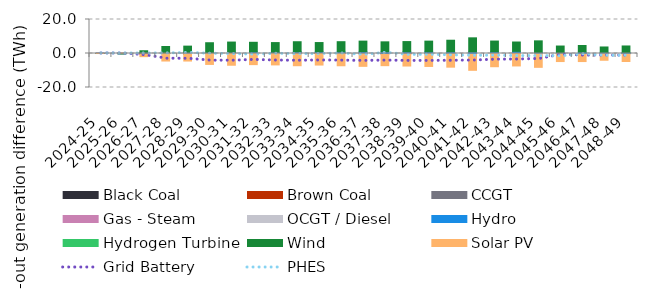
| Category | Black Coal | Brown Coal | CCGT | Gas - Steam | OCGT / Diesel | Hydro | Hydrogen Turbine | Wind | Solar PV |
|---|---|---|---|---|---|---|---|---|---|
| 2024-25 | -0.01 | 0.062 | 0 | 0 | -0.007 | 0.051 | 0 | -0.001 | -0.001 |
| 2025-26 | 0.093 | -0.1 | 0.001 | 0.142 | 0.006 | -0.036 | 0 | -0.117 | 0.017 |
| 2026-27 | -0.463 | 0.434 | 0.005 | -0.006 | 0.014 | 0.036 | 0 | 1.13 | -1.388 |
| 2027-28 | -0.13 | 0.093 | 0.001 | -0.026 | 0.026 | 0.018 | 0 | 3.988 | -4.273 |
| 2028-29 | -0.368 | 0.319 | -0.064 | 0.003 | 0.122 | 0.199 | 0 | 3.694 | -4.006 |
| 2029-30 | 0.001 | 0 | -0.004 | -0.061 | -0.041 | 0.317 | 0 | 6.019 | -6.325 |
| 2030-31 | -0.046 | 0.139 | 0.011 | 0 | 0.006 | 0.483 | 0 | 6.09 | -6.864 |
| 2031-32 | -0.079 | 0.281 | 0.003 | 0.001 | 0.011 | 0.644 | 0 | 5.655 | -6.472 |
| 2032-33 | -0.064 | 0.058 | 0.083 | 0.004 | -0.001 | 0.582 | 0 | 5.695 | -6.644 |
| 2033-34 | 0.634 | 0.053 | -0.104 | 0.002 | 0.008 | 0.255 | 0 | 5.973 | -7.086 |
| 2034-35 | 0.159 | 0.036 | 0.324 | 0.025 | 0.047 | 0.356 | 0 | 5.496 | -6.799 |
| 2035-36 | 0.203 | 0.044 | -0.019 | -0.008 | -0.152 | 0.686 | 0 | 6.014 | -7.036 |
| 2036-37 | 0.217 | 0.036 | -0.149 | -0.003 | -0.069 | 0.829 | 0 | 6.202 | -7.335 |
| 2037-38 | -0.03 | 0.03 | -0.188 | -0.043 | -0.254 | 0.985 | 0 | 5.845 | -6.641 |
| 2038-39 | 0.165 | 0.031 | -0.203 | -0.019 | -0.132 | 0.826 | 0 | 5.992 | -7.018 |
| 2039-40 | -0.102 | 0.032 | 0.044 | 0 | -0.102 | 0.899 | 0 | 6.304 | -7.413 |
| 2040-41 | -0.088 | 0.028 | 0.053 | 0 | -0.134 | 0.883 | 0 | 6.845 | -7.818 |
| 2041-42 | 0.088 | 0.028 | 0.051 | 0 | -0.611 | 0.772 | 0 | 8.278 | -9.285 |
| 2042-43 | 0.057 | 0.04 | 0.382 | 0 | -0.23 | 0.515 | 0 | 6.327 | -7.545 |
| 2043-44 | 0.14 | 0.036 | 0.035 | 0 | 0.326 | 0.736 | 0 | 5.484 | -7.324 |
| 2044-45 | 0.025 | 0.012 | 0.057 | 0 | -0.29 | 0.525 | 0 | 6.823 | -7.85 |
| 2045-46 | 0.069 | 0.021 | 0.04 | 0 | -0.262 | 0.333 | 0 | 3.931 | -4.474 |
| 2046-47 | 0.047 | 0.005 | 0.003 | 0 | -0.447 | 0.7 | 0 | 3.936 | -4.292 |
| 2047-48 | 0.09 | 0 | 0.004 | 0 | -0.29 | 0.579 | 0 | 3.165 | -3.686 |
| 2048-49 | 0.083 | 0 | -0.005 | 0 | -0.415 | 0.436 | 0 | 3.912 | -4.301 |